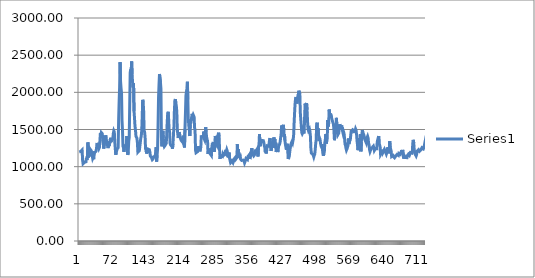
| Category | Series 0 |
|---|---|
| 0 | 1198.5 |
| 1 | 1199.75 |
| 2 | 1194 |
| 3 | 1204.25 |
| 4 | 1206.75 |
| 5 | 1213 |
| 6 | 1224.5 |
| 7 | 1087 |
| 8 | 1039.5 |
| 9 | 1044.75 |
| 10 | 1045.75 |
| 11 | 1058.25 |
| 12 | 1062 |
| 13 | 1069.5 |
| 14 | 1065.25 |
| 15 | 1120 |
| 16 | 1090 |
| 17 | 1147.25 |
| 18 | 1326.75 |
| 19 | 1124.25 |
| 20 | 1173 |
| 21 | 1247.25 |
| 22 | 1140.25 |
| 23 | 1233 |
| 24 | 1231.25 |
| 25 | 1214.25 |
| 26 | 1180.25 |
| 27 | 1172.5 |
| 28 | 1110 |
| 29 | 1124.5 |
| 30 | 1099.75 |
| 31 | 1207.5 |
| 32 | 1188.25 |
| 33 | 1191.75 |
| 34 | 1196.75 |
| 35 | 1208.25 |
| 36 | 1250.5 |
| 37 | 1319 |
| 38 | 1302.25 |
| 39 | 1295 |
| 40 | 1272.5 |
| 41 | 1245 |
| 42 | 1259.75 |
| 43 | 1348 |
| 44 | 1451.5 |
| 45 | 1411 |
| 46 | 1458.25 |
| 47 | 1453.25 |
| 48 | 1443.5 |
| 49 | 1346.25 |
| 50 | 1310.5 |
| 51 | 1243.25 |
| 52 | 1242.75 |
| 53 | 1343.5 |
| 54 | 1369.25 |
| 55 | 1422.5 |
| 56 | 1379.75 |
| 57 | 1343.75 |
| 58 | 1304.75 |
| 59 | 1283.25 |
| 60 | 1249.5 |
| 61 | 1330.25 |
| 62 | 1275.5 |
| 63 | 1339 |
| 64 | 1318 |
| 65 | 1387.5 |
| 66 | 1333.75 |
| 67 | 1354.75 |
| 68 | 1352 |
| 69 | 1367 |
| 70 | 1386.5 |
| 71 | 1449 |
| 72 | 1481.5 |
| 73 | 1466.5 |
| 74 | 1323.5 |
| 75 | 1335.5 |
| 76 | 1159.5 |
| 77 | 1193.25 |
| 78 | 1187.25 |
| 79 | 1240.5 |
| 80 | 1231.5 |
| 81 | 1256.5 |
| 82 | 1636.25 |
| 83 | 1871.75 |
| 84 | 2063 |
| 85 | 2406 |
| 86 | 2143 |
| 87 | 2057.75 |
| 88 | 1987.25 |
| 89 | 1623 |
| 90 | 1487.5 |
| 91 | 1272.25 |
| 92 | 1258.5 |
| 93 | 1198.75 |
| 94 | 1258.75 |
| 95 | 1297 |
| 96 | 1287.5 |
| 97 | 1251.5 |
| 98 | 1301.25 |
| 99 | 1411.75 |
| 100 | 1235.75 |
| 101 | 1158 |
| 102 | 1203.5 |
| 103 | 1345 |
| 104 | 1393 |
| 105 | 1824.75 |
| 106 | 2266.75 |
| 107 | 2307.75 |
| 108 | 2264.25 |
| 109 | 2415 |
| 110 | 2238 |
| 111 | 2135 |
| 112 | 2066.25 |
| 113 | 2122.25 |
| 114 | 1745.75 |
| 115 | 1654.75 |
| 116 | 1546 |
| 117 | 1496 |
| 118 | 1410.25 |
| 119 | 1405.25 |
| 120 | 1382.25 |
| 121 | 1324.5 |
| 122 | 1194.5 |
| 123 | 1188.25 |
| 124 | 1197.25 |
| 125 | 1214.75 |
| 126 | 1220 |
| 127 | 1323.75 |
| 128 | 1381.75 |
| 129 | 1409.75 |
| 130 | 1481.75 |
| 131 | 1660.25 |
| 132 | 1899.25 |
| 133 | 1866 |
| 134 | 1752.75 |
| 135 | 1489 |
| 136 | 1464.25 |
| 137 | 1402.25 |
| 138 | 1231.5 |
| 139 | 1246.75 |
| 140 | 1177 |
| 141 | 1193 |
| 142 | 1204 |
| 143 | 1236.5 |
| 144 | 1230.25 |
| 145 | 1230.75 |
| 146 | 1228 |
| 147 | 1196.75 |
| 148 | 1143 |
| 149 | 1134.5 |
| 150 | 1128 |
| 151 | 1116.25 |
| 152 | 1094.5 |
| 153 | 1091.75 |
| 154 | 1108.5 |
| 155 | 1134.25 |
| 156 | 1128.75 |
| 157 | 1144 |
| 158 | 1140.5 |
| 159 | 1190.5 |
| 160 | 1260.25 |
| 161 | 1068.75 |
| 162 | 1155.75 |
| 163 | 1239.75 |
| 164 | 1554.5 |
| 165 | 1929.5 |
| 166 | 2106.25 |
| 167 | 2246 |
| 168 | 2243.25 |
| 169 | 2134.5 |
| 170 | 2047 |
| 171 | 1393.75 |
| 172 | 1273.5 |
| 173 | 1399 |
| 174 | 1483.5 |
| 175 | 1378 |
| 176 | 1294.75 |
| 177 | 1271 |
| 178 | 1281.75 |
| 179 | 1289 |
| 180 | 1295.75 |
| 181 | 1313.75 |
| 182 | 1422 |
| 183 | 1592 |
| 184 | 1703.75 |
| 185 | 1738.25 |
| 186 | 1642.5 |
| 187 | 1502.75 |
| 188 | 1470.5 |
| 189 | 1315.5 |
| 190 | 1292.5 |
| 191 | 1293.5 |
| 192 | 1299 |
| 193 | 1272.25 |
| 194 | 1241.5 |
| 195 | 1304 |
| 196 | 1314 |
| 197 | 1541.75 |
| 198 | 1756 |
| 199 | 1889.75 |
| 200 | 1910 |
| 201 | 1853.25 |
| 202 | 1819.75 |
| 203 | 1736.75 |
| 204 | 1505 |
| 205 | 1439 |
| 206 | 1385.5 |
| 207 | 1424.5 |
| 208 | 1465 |
| 209 | 1471.25 |
| 210 | 1391.75 |
| 211 | 1394.25 |
| 212 | 1353.75 |
| 213 | 1357.75 |
| 214 | 1338 |
| 215 | 1330 |
| 216 | 1334 |
| 217 | 1415.75 |
| 218 | 1293 |
| 219 | 1258.5 |
| 220 | 1508 |
| 221 | 1718 |
| 222 | 1953.25 |
| 223 | 2010 |
| 224 | 2049.5 |
| 225 | 2142.5 |
| 226 | 1904.25 |
| 227 | 1588.5 |
| 228 | 1604.5 |
| 229 | 1616 |
| 230 | 1412 |
| 231 | 1562 |
| 232 | 1641.25 |
| 233 | 1626.5 |
| 234 | 1638.75 |
| 235 | 1711.5 |
| 236 | 1682.5 |
| 237 | 1699.5 |
| 238 | 1699 |
| 239 | 1669.75 |
| 240 | 1526 |
| 241 | 1475.25 |
| 242 | 1221.5 |
| 243 | 1187.25 |
| 244 | 1185.25 |
| 245 | 1194.75 |
| 246 | 1201.5 |
| 247 | 1265.5 |
| 248 | 1242 |
| 249 | 1275.75 |
| 250 | 1233.25 |
| 251 | 1205.25 |
| 252 | 1199.5 |
| 253 | 1270.5 |
| 254 | 1420.5 |
| 255 | 1400.25 |
| 256 | 1411 |
| 257 | 1413.25 |
| 258 | 1406.25 |
| 259 | 1471.75 |
| 260 | 1372 |
| 261 | 1357.5 |
| 262 | 1414.5 |
| 263 | 1531.25 |
| 264 | 1460.25 |
| 265 | 1400 |
| 266 | 1363.5 |
| 267 | 1349 |
| 268 | 1172.75 |
| 269 | 1229.25 |
| 270 | 1193.75 |
| 271 | 1244.75 |
| 272 | 1176.75 |
| 273 | 1174.25 |
| 274 | 1167.5 |
| 275 | 1149.75 |
| 276 | 1267 |
| 277 | 1313 |
| 278 | 1294.25 |
| 279 | 1331.5 |
| 280 | 1262.25 |
| 281 | 1197.75 |
| 282 | 1273 |
| 283 | 1413.5 |
| 284 | 1377.25 |
| 285 | 1311.5 |
| 286 | 1298 |
| 287 | 1373 |
| 288 | 1416 |
| 289 | 1429.75 |
| 290 | 1457 |
| 291 | 1404.25 |
| 292 | 1225.25 |
| 293 | 1105.5 |
| 294 | 1162.5 |
| 295 | 1141.25 |
| 296 | 1132 |
| 297 | 1140 |
| 298 | 1134.75 |
| 299 | 1165.75 |
| 300 | 1150 |
| 301 | 1146 |
| 302 | 1160.5 |
| 303 | 1160.75 |
| 304 | 1165.5 |
| 305 | 1226.5 |
| 306 | 1204.25 |
| 307 | 1229 |
| 308 | 1209.5 |
| 309 | 1200.75 |
| 310 | 1123.75 |
| 311 | 1170.25 |
| 312 | 1189.75 |
| 313 | 1107.5 |
| 314 | 1079.5 |
| 315 | 1098.75 |
| 316 | 1062.25 |
| 317 | 1073 |
| 318 | 1078.25 |
| 319 | 1070.5 |
| 320 | 1054 |
| 321 | 1072.25 |
| 322 | 1072.75 |
| 323 | 1110.25 |
| 324 | 1111.25 |
| 325 | 1126.25 |
| 326 | 1104.25 |
| 327 | 1101.75 |
| 328 | 1124 |
| 329 | 1302 |
| 330 | 1124 |
| 331 | 1235.25 |
| 332 | 1174.75 |
| 333 | 1159.75 |
| 334 | 1174.5 |
| 335 | 1114.25 |
| 336 | 1098.5 |
| 337 | 1093.5 |
| 338 | 1084.5 |
| 339 | 1085.5 |
| 340 | 1097.5 |
| 341 | 1088.75 |
| 342 | 1088.75 |
| 343 | 1073.5 |
| 344 | 1050.75 |
| 345 | 1067.75 |
| 346 | 1071.5 |
| 347 | 1110.5 |
| 348 | 1105.5 |
| 349 | 1116 |
| 350 | 1095.25 |
| 351 | 1137.75 |
| 352 | 1147.25 |
| 353 | 1153.5 |
| 354 | 1103.5 |
| 355 | 1153 |
| 356 | 1170.75 |
| 357 | 1155.75 |
| 358 | 1188.5 |
| 359 | 1248.75 |
| 360 | 1203.75 |
| 361 | 1166.75 |
| 362 | 1169.25 |
| 363 | 1144.75 |
| 364 | 1143 |
| 365 | 1161.5 |
| 366 | 1183 |
| 367 | 1230.5 |
| 368 | 1211.5 |
| 369 | 1214.75 |
| 370 | 1234 |
| 371 | 1225.5 |
| 372 | 1137.5 |
| 373 | 1261 |
| 374 | 1281.75 |
| 375 | 1438.5 |
| 376 | 1309 |
| 377 | 1275.5 |
| 378 | 1348.25 |
| 379 | 1325.75 |
| 380 | 1352.75 |
| 381 | 1360.25 |
| 382 | 1354 |
| 383 | 1350.25 |
| 384 | 1326.75 |
| 385 | 1283.25 |
| 386 | 1264.75 |
| 387 | 1196.25 |
| 388 | 1230.25 |
| 389 | 1178.25 |
| 390 | 1217.5 |
| 391 | 1280 |
| 392 | 1269 |
| 393 | 1272 |
| 394 | 1275.25 |
| 395 | 1307.5 |
| 396 | 1360.25 |
| 397 | 1384 |
| 398 | 1319.5 |
| 399 | 1212.25 |
| 400 | 1244.5 |
| 401 | 1243.5 |
| 402 | 1304.5 |
| 403 | 1257 |
| 404 | 1259.75 |
| 405 | 1392 |
| 406 | 1348.5 |
| 407 | 1372.25 |
| 408 | 1254 |
| 409 | 1322.25 |
| 410 | 1200 |
| 411 | 1259.5 |
| 412 | 1268.5 |
| 413 | 1197.25 |
| 414 | 1229 |
| 415 | 1278.5 |
| 416 | 1274 |
| 417 | 1304.75 |
| 418 | 1334.25 |
| 419 | 1335.5 |
| 420 | 1435.5 |
| 421 | 1553.75 |
| 422 | 1554.5 |
| 423 | 1490 |
| 424 | 1548.75 |
| 425 | 1562.25 |
| 426 | 1401.5 |
| 427 | 1439 |
| 428 | 1350.75 |
| 429 | 1299.25 |
| 430 | 1259.25 |
| 431 | 1227.75 |
| 432 | 1223 |
| 433 | 1286.75 |
| 434 | 1308.5 |
| 435 | 1102.5 |
| 436 | 1119.75 |
| 437 | 1137 |
| 438 | 1200.5 |
| 439 | 1248.5 |
| 440 | 1243 |
| 441 | 1311 |
| 442 | 1329.25 |
| 443 | 1343 |
| 444 | 1325.75 |
| 445 | 1358.5 |
| 446 | 1414.75 |
| 447 | 1572.25 |
| 448 | 1711.5 |
| 449 | 1840.25 |
| 450 | 1906.75 |
| 451 | 1936.5 |
| 452 | 1901.25 |
| 453 | 1849 |
| 454 | 1857 |
| 455 | 1861.75 |
| 456 | 1977.5 |
| 457 | 2022 |
| 458 | 2009.5 |
| 459 | 1976.75 |
| 460 | 1725.25 |
| 461 | 1631.75 |
| 462 | 1551 |
| 463 | 1457.75 |
| 464 | 1442.5 |
| 465 | 1456.25 |
| 466 | 1464 |
| 467 | 1452 |
| 468 | 1461.25 |
| 469 | 1678.25 |
| 470 | 1848.5 |
| 471 | 1824.5 |
| 472 | 1837.75 |
| 473 | 1856.5 |
| 474 | 1766 |
| 475 | 1615.75 |
| 476 | 1505.5 |
| 477 | 1483.25 |
| 478 | 1486.25 |
| 479 | 1506.25 |
| 480 | 1476.25 |
| 481 | 1410.75 |
| 482 | 1243.75 |
| 483 | 1183.25 |
| 484 | 1170.25 |
| 485 | 1173 |
| 486 | 1165.25 |
| 487 | 1151 |
| 488 | 1130 |
| 489 | 1152.75 |
| 490 | 1169 |
| 491 | 1228.5 |
| 492 | 1310.25 |
| 493 | 1360.75 |
| 494 | 1570 |
| 495 | 1592 |
| 496 | 1453.5 |
| 497 | 1516.25 |
| 498 | 1424.75 |
| 499 | 1344.25 |
| 500 | 1384.25 |
| 501 | 1370.5 |
| 502 | 1315.5 |
| 503 | 1284.75 |
| 504 | 1260 |
| 505 | 1304.25 |
| 506 | 1232 |
| 507 | 1174.25 |
| 508 | 1145.75 |
| 509 | 1175.75 |
| 510 | 1201.5 |
| 511 | 1322.75 |
| 512 | 1360.5 |
| 513 | 1436.5 |
| 514 | 1312.25 |
| 515 | 1340.75 |
| 516 | 1378.25 |
| 517 | 1628 |
| 518 | 1541 |
| 519 | 1580.5 |
| 520 | 1769 |
| 521 | 1758.25 |
| 522 | 1670.75 |
| 523 | 1712 |
| 524 | 1714.5 |
| 525 | 1657.75 |
| 526 | 1665.25 |
| 527 | 1609.75 |
| 528 | 1602.75 |
| 529 | 1570.25 |
| 530 | 1479 |
| 531 | 1356 |
| 532 | 1410.5 |
| 533 | 1499.25 |
| 534 | 1517.5 |
| 535 | 1656.75 |
| 536 | 1560 |
| 537 | 1459.25 |
| 538 | 1428.5 |
| 539 | 1420 |
| 540 | 1452.25 |
| 541 | 1533.75 |
| 542 | 1569.75 |
| 543 | 1562.5 |
| 544 | 1578.75 |
| 545 | 1513.5 |
| 546 | 1554.25 |
| 547 | 1505 |
| 548 | 1495 |
| 549 | 1448.75 |
| 550 | 1468 |
| 551 | 1446 |
| 552 | 1385.25 |
| 553 | 1304 |
| 554 | 1286.75 |
| 555 | 1248.5 |
| 556 | 1222.5 |
| 557 | 1238 |
| 558 | 1251.25 |
| 559 | 1278 |
| 560 | 1379 |
| 561 | 1304 |
| 562 | 1334.75 |
| 563 | 1332.5 |
| 564 | 1362.25 |
| 565 | 1430.25 |
| 566 | 1490.75 |
| 567 | 1473 |
| 568 | 1476 |
| 569 | 1496.25 |
| 570 | 1486.25 |
| 571 | 1490.75 |
| 572 | 1483 |
| 573 | 1451.75 |
| 574 | 1461.25 |
| 575 | 1506.75 |
| 576 | 1490.5 |
| 577 | 1435.75 |
| 578 | 1349.5 |
| 579 | 1292 |
| 580 | 1221.75 |
| 581 | 1289.5 |
| 582 | 1386.75 |
| 583 | 1294.25 |
| 584 | 1261.5 |
| 585 | 1440.25 |
| 586 | 1206 |
| 587 | 1340 |
| 588 | 1419.5 |
| 589 | 1492.75 |
| 590 | 1463.25 |
| 591 | 1476.5 |
| 592 | 1430.75 |
| 593 | 1426.75 |
| 594 | 1368.75 |
| 595 | 1376.75 |
| 596 | 1371.25 |
| 597 | 1323.5 |
| 598 | 1372 |
| 599 | 1392 |
| 600 | 1408.5 |
| 601 | 1386.75 |
| 602 | 1318.75 |
| 603 | 1293 |
| 604 | 1228.75 |
| 605 | 1202 |
| 606 | 1210.5 |
| 607 | 1235 |
| 608 | 1239.75 |
| 609 | 1253.75 |
| 610 | 1264 |
| 611 | 1262 |
| 612 | 1276.25 |
| 613 | 1252.5 |
| 614 | 1217.75 |
| 615 | 1212.5 |
| 616 | 1240 |
| 617 | 1244.5 |
| 618 | 1237 |
| 619 | 1241.5 |
| 620 | 1332.25 |
| 621 | 1359.5 |
| 622 | 1356.25 |
| 623 | 1412 |
| 624 | 1311.75 |
| 625 | 1319 |
| 626 | 1269.5 |
| 627 | 1163 |
| 628 | 1166.75 |
| 629 | 1186.75 |
| 630 | 1195.25 |
| 631 | 1229 |
| 632 | 1192.25 |
| 633 | 1188 |
| 634 | 1202.75 |
| 635 | 1233.25 |
| 636 | 1224.25 |
| 637 | 1231.75 |
| 638 | 1185.75 |
| 639 | 1169 |
| 640 | 1188.5 |
| 641 | 1194.25 |
| 642 | 1260 |
| 643 | 1180.75 |
| 644 | 1175 |
| 645 | 1222.75 |
| 646 | 1344 |
| 647 | 1265.5 |
| 648 | 1262.5 |
| 649 | 1209 |
| 650 | 1136.5 |
| 651 | 1134.75 |
| 652 | 1136 |
| 653 | 1149.5 |
| 654 | 1132.5 |
| 655 | 1134.75 |
| 656 | 1119 |
| 657 | 1120.5 |
| 658 | 1131.25 |
| 659 | 1146.5 |
| 660 | 1155.25 |
| 661 | 1162.75 |
| 662 | 1151.25 |
| 663 | 1150.25 |
| 664 | 1150.75 |
| 665 | 1178.25 |
| 666 | 1166.25 |
| 667 | 1170.75 |
| 668 | 1165.25 |
| 669 | 1172.5 |
| 670 | 1161.75 |
| 671 | 1219.75 |
| 672 | 1173 |
| 673 | 1225.5 |
| 674 | 1162.75 |
| 675 | 1108 |
| 676 | 1128.25 |
| 677 | 1142.5 |
| 678 | 1129.25 |
| 679 | 1122.75 |
| 680 | 1113.75 |
| 681 | 1121.25 |
| 682 | 1121 |
| 683 | 1151 |
| 684 | 1161 |
| 685 | 1169 |
| 686 | 1157 |
| 687 | 1153 |
| 688 | 1154 |
| 689 | 1189.5 |
| 690 | 1181.25 |
| 691 | 1186.5 |
| 692 | 1182.5 |
| 693 | 1201.25 |
| 694 | 1316.25 |
| 695 | 1361 |
| 696 | 1320.25 |
| 697 | 1229.75 |
| 698 | 1179.25 |
| 699 | 1177 |
| 700 | 1186 |
| 701 | 1143.5 |
| 702 | 1163.5 |
| 703 | 1210 |
| 704 | 1203.25 |
| 705 | 1222.5 |
| 706 | 1228.75 |
| 707 | 1219.25 |
| 708 | 1207.5 |
| 709 | 1218.75 |
| 710 | 1216.25 |
| 711 | 1225.5 |
| 712 | 1231.5 |
| 713 | 1254.25 |
| 714 | 1243.25 |
| 715 | 1253.75 |
| 716 | 1240 |
| 717 | 1256.25 |
| 718 | 1243.25 |
| 719 | 1317 |
| 720 | 1349 |
| 721 | 1331.5 |